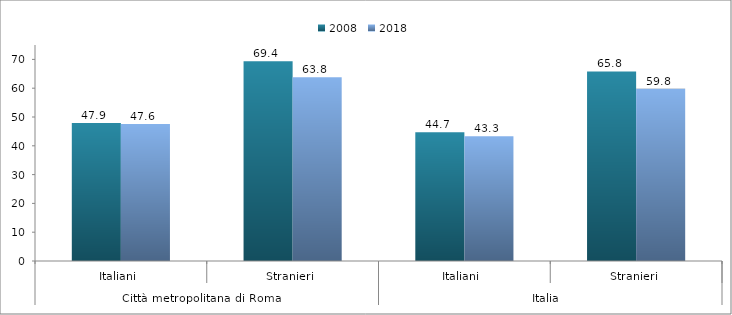
| Category | 2008 | 2018 |
|---|---|---|
| 0 | 47.9 | 47.61 |
| 1 | 69.4 | 63.798 |
| 2 | 44.7 | 43.321 |
| 3 | 65.8 | 59.788 |